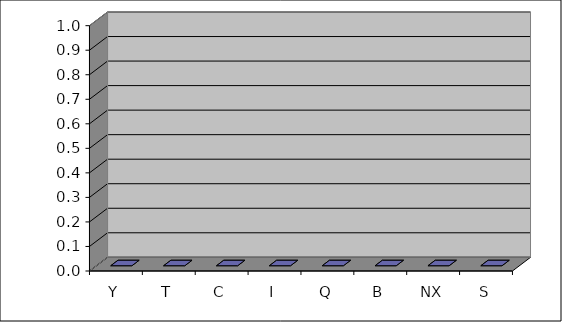
| Category | Series 0 |
|---|---|
| Y | 0 |
| T | 0 |
| C | 0 |
| I | 0 |
| Q | 0 |
| B | 0 |
| NX | 0 |
| S | 0 |